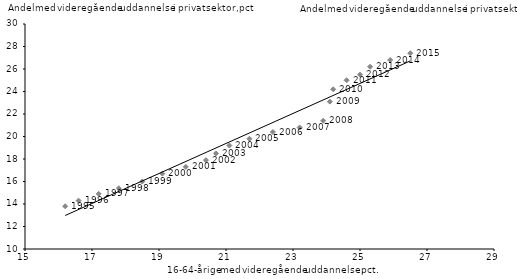
| Category | Andel med videregående uddannelse i privat sektor |
|---|---|
| 16.2 | 13.8 |
| 16.6 | 14.3 |
| 17.2 | 14.9 |
| 17.8 | 15.4 |
| 18.5 | 16 |
| 19.1 | 16.7 |
| 19.8 | 17.3 |
| 20.4 | 17.9 |
| 20.7 | 18.5 |
| 21.1 | 19.2 |
| 21.7 | 19.8 |
| 22.4 | 20.4 |
| 23.2 | 20.8 |
| 23.9 | 21.4 |
| 24.1 | 23.1 |
| 24.2 | 24.2 |
| 24.6 | 25 |
| 25.0 | 25.5 |
| 25.3 | 26.2 |
| 25.9 | 26.8 |
| 26.5 | 27.4 |